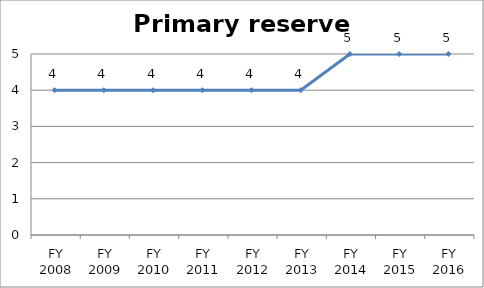
| Category | Primary reserve score |
|---|---|
| FY 2016 | 5 |
| FY 2015 | 5 |
| FY 2014 | 5 |
| FY 2013 | 4 |
| FY 2012 | 4 |
| FY 2011 | 4 |
| FY 2010 | 4 |
| FY 2009 | 4 |
| FY 2008 | 4 |